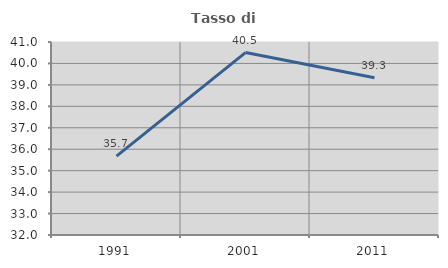
| Category | Tasso di occupazione   |
|---|---|
| 1991.0 | 35.676 |
| 2001.0 | 40.508 |
| 2011.0 | 39.333 |